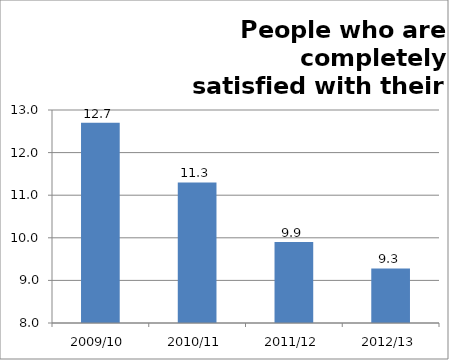
| Category | Series 0 |
|---|---|
| 2009/10 | 12.7 |
| 2010/11 | 11.3 |
| 2011/12 | 9.9 |
| 2012/13 | 9.28 |